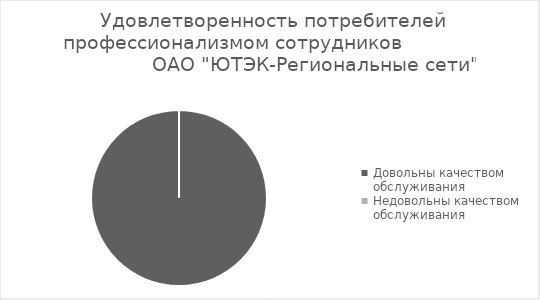
| Category | Удовлетворенность потребителей профессионализмом сотрудников ОАО "ЮТЭК-Региональные сети" |
|---|---|
| Довольны качеством обслуживания | 100 |
| Недовольны качеством обслуживания | 0 |